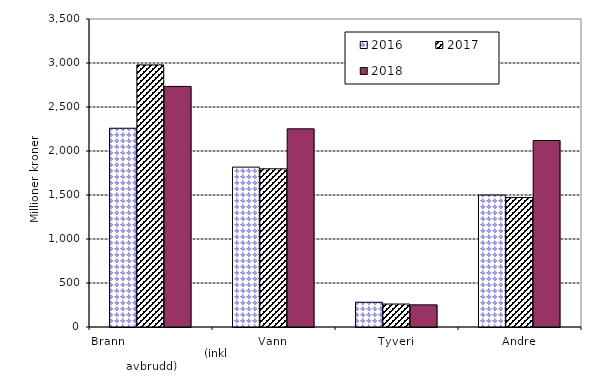
| Category | 2016 | 2017 | 2018 |
|---|---|---|---|
| Brann                                                       (inkl avbrudd) | 2258.695 | 2978.266 | 2733.966 |
| Vann | 1816.834 | 1797.656 | 2251.792 |
| Tyveri | 281.208 | 261.096 | 251.618 |
| Andre | 1499.083 | 1471.808 | 2119.387 |